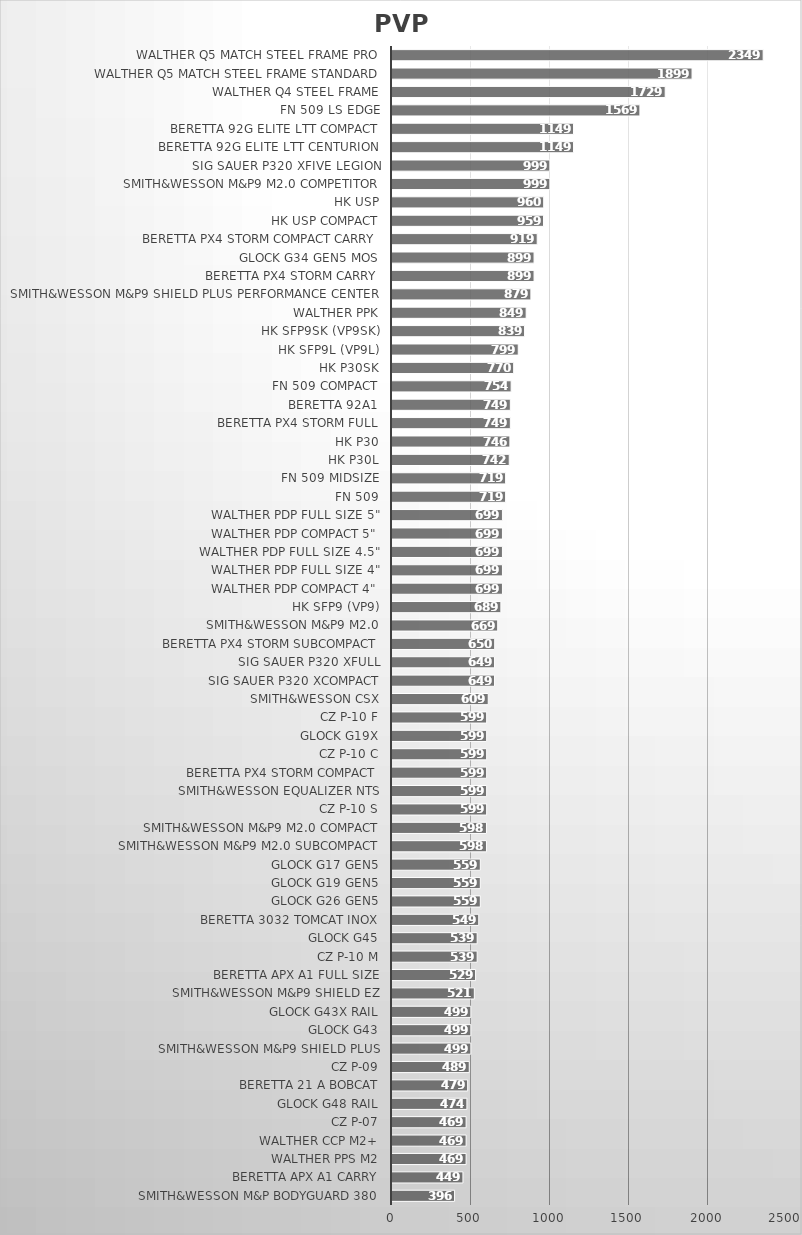
| Category | PVP ($) |
|---|---|
| Smith&Wesson M&P Bodyguard 380 | 396 |
| Beretta APX A1 Carry | 449 |
| Walther PPS M2 | 469 |
| Walther CCP M2+ | 469 |
| CZ P-07 | 469 |
| Glock G48 Rail | 474 |
| Beretta 21 A Bobcat | 479 |
| CZ P-09 | 489 |
| Smith&Wesson M&P9 Shield Plus | 499 |
| Glock G43 | 499 |
| Glock G43X Rail | 499 |
| Smith&Wesson M&P9 Shield EZ | 521 |
| Beretta APX A1 Full Size | 529 |
| CZ P-10 M | 539 |
| Glock G45 | 539 |
| Beretta 3032 Tomcat Inox | 549 |
| Glock G26 Gen5 | 559 |
| Glock G19 Gen5 | 559 |
| Glock G17 Gen5 | 559 |
| Smith&Wesson M&P9 M2.0 Subcompact | 598 |
| Smith&Wesson M&P9 M2.0 Compact | 598 |
| CZ P-10 S | 599 |
| Smith&Wesson Equalizer NTS | 599 |
| Beretta Px4 Storm Compact | 599 |
| CZ P-10 C | 599 |
| Glock G19X | 599 |
| CZ P-10 F | 599 |
| Smith&Wesson CSX | 609 |
| SIG Sauer P320 XCOMPACT | 649 |
| SIG Sauer P320 XFULL | 649 |
| Beretta Px4 Storm SubCompact | 650 |
| Smith&Wesson M&P9 M2.0 | 669 |
| HK SFP9 (VP9) | 689 |
| Walther PDP Compact 4" | 699 |
| Walther PDP Full Size 4" | 699 |
| Walther PDP Full Size 4.5" | 699 |
| Walther PDP Compact 5" | 699 |
| Walther PDP Full Size 5" | 699 |
| FN 509 | 719 |
| FN 509 Midsize | 719 |
| HK P30L | 742 |
| HK P30 | 746 |
| Beretta Px4 Storm Full | 749 |
| Beretta 92A1 | 749 |
| FN 509 Compact | 754 |
| HK P30SK | 770 |
| HK SFP9L (VP9L) | 799 |
| HK SFP9SK (VP9SK) | 839 |
| Walther PPK | 849 |
| Smith&Wesson M&P9 Shield Plus Performance Center | 879 |
| Beretta Px4 Storm Carry | 899 |
| Glock G34 Gen5 MOS | 899 |
| Beretta Px4 Storm Compact Carry | 919 |
| HK USP Compact | 959 |
| HK USP | 960 |
| Smith&Wesson M&P9 M2.0 Competitor | 999 |
| SIG Sauer P320 XFIVE Legion | 999 |
| Beretta 92G Elite LTT Centurion | 1149 |
| Beretta 92G Elite LTT Compact | 1149 |
| FN 509 LS Edge | 1569 |
| Walther Q4 Steel Frame | 1729 |
| Walther Q5 Match Steel Frame Standard | 1899 |
| Walther Q5 Match Steel Frame Pro | 2349 |